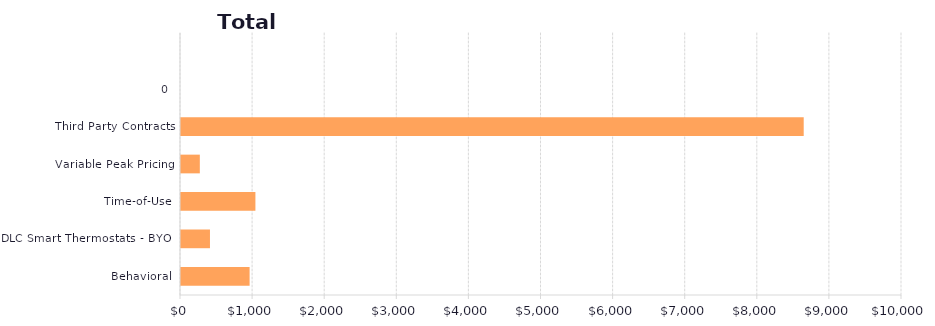
| Category | Series 1 |
|---|---|
| Behavioral | 951.475 |
| DLC Smart Thermostats - BYOT | 401.748 |
| Time-of-Use | 1032.081 |
| Variable Peak Pricing | 261.094 |
| Third Party Contracts | 8636.754 |
| 0 | 0 |